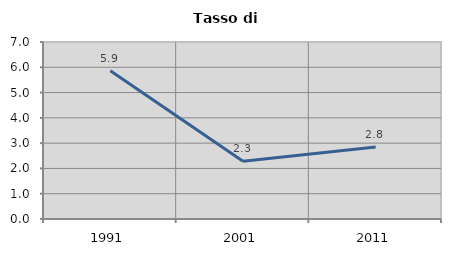
| Category | Tasso di disoccupazione   |
|---|---|
| 1991.0 | 5.864 |
| 2001.0 | 2.284 |
| 2011.0 | 2.847 |